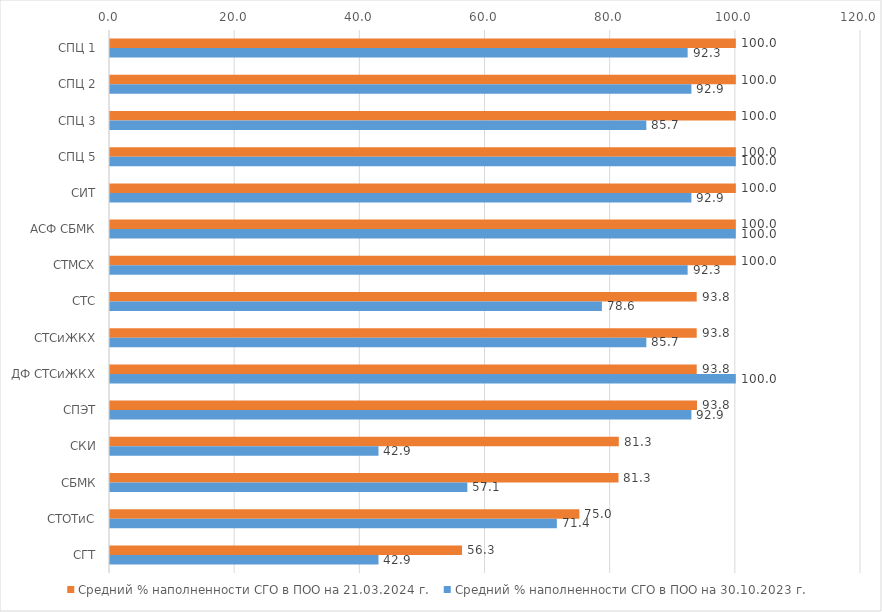
| Category | Средний % наполненности СГО в ПОО на 21.03.2024 г.  | Средний % наполненности СГО в ПОО на 30.10.2023 г.  |
|---|---|---|
| СПЦ 1 | 100 | 92.3 |
| СПЦ 2 | 100 | 92.9 |
| СПЦ 3 | 100 | 85.7 |
| СПЦ 5 | 100 | 100 |
| СИТ | 100 | 92.9 |
| АСФ СБМК | 100 | 100 |
| СТМСХ | 100 | 92.3 |
| СТС | 93.75 | 78.6 |
| СТСиЖКХ | 93.75 | 85.7 |
| ДФ СТСиЖКХ | 93.75 | 100 |
| СПЭТ | 93.8 | 92.9 |
| СКИ | 81.3 | 42.9 |
| СБМК | 81.25 | 57.1 |
| СТОТиС | 75 | 71.4 |
| СГТ | 56.25 | 42.9 |